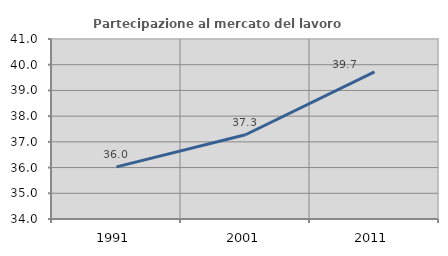
| Category | Partecipazione al mercato del lavoro  femminile |
|---|---|
| 1991.0 | 36.027 |
| 2001.0 | 37.276 |
| 2011.0 | 39.72 |